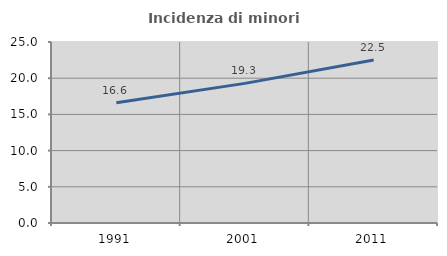
| Category | Incidenza di minori stranieri |
|---|---|
| 1991.0 | 16.613 |
| 2001.0 | 19.285 |
| 2011.0 | 22.509 |